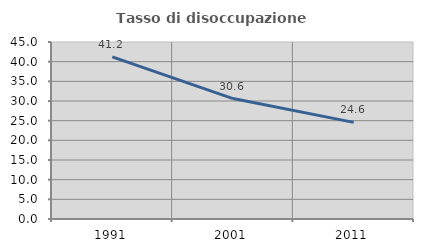
| Category | Tasso di disoccupazione giovanile  |
|---|---|
| 1991.0 | 41.205 |
| 2001.0 | 30.623 |
| 2011.0 | 24.571 |